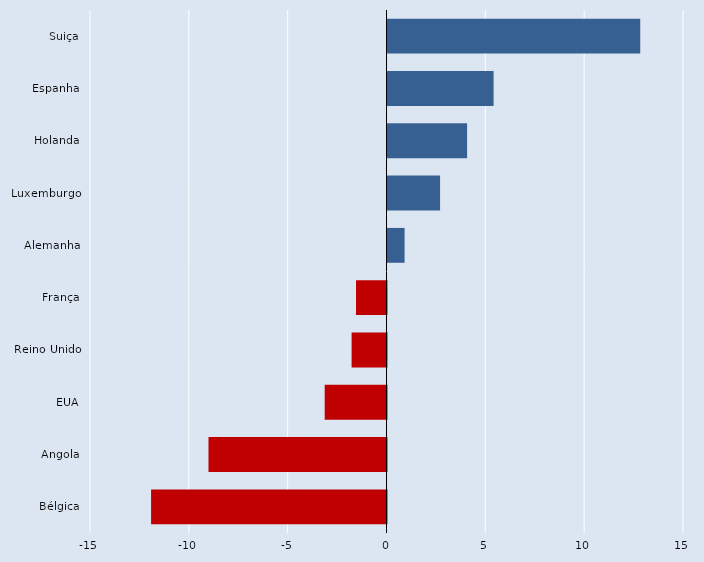
| Category | Series 0 |
|---|---|
| Suiça | 12.786 |
| Espanha | 5.367 |
| Holanda | 4.027 |
| Luxemburgo | 2.66 |
| Alemanha | 0.865 |
| França | -1.542 |
| Reino Unido | -1.765 |
| EUA | -3.127 |
| Angola | -9.005 |
| Bélgica | -11.91 |